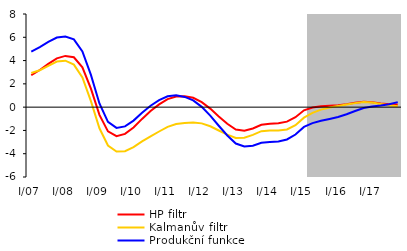
| Category | HP filtr | Kalmanův filtr | Produkční funkce |
|---|---|---|---|
| I/07 | 2.741 | 2.938 | 4.777 |
| II | 3.189 | 3.168 | 5.161 |
| III | 3.713 | 3.54 | 5.6 |
| IV | 4.189 | 3.913 | 5.974 |
| I/08 | 4.401 | 3.991 | 6.07 |
| II | 4.283 | 3.656 | 5.82 |
| III | 3.414 | 2.548 | 4.791 |
| IV | 1.584 | 0.521 | 2.77 |
| I/09 | -0.662 | -1.814 | 0.319 |
| II | -2.079 | -3.297 | -1.26 |
| III | -2.493 | -3.819 | -1.782 |
| IV | -2.295 | -3.787 | -1.652 |
| I/10 | -1.748 | -3.436 | -1.156 |
| II | -1.01 | -2.943 | -0.475 |
| III | -0.338 | -2.504 | 0.119 |
| IV | 0.239 | -2.092 | 0.598 |
| I/11 | 0.691 | -1.698 | 0.935 |
| II | 0.916 | -1.452 | 1.024 |
| III | 0.925 | -1.366 | 0.878 |
| IV | 0.801 | -1.313 | 0.581 |
| I/12 | 0.432 | -1.394 | 0.025 |
| II | -0.128 | -1.642 | -0.728 |
| III | -0.796 | -2.005 | -1.597 |
| IV | -1.429 | -2.362 | -2.434 |
| I/13 | -1.925 | -2.655 | -3.125 |
| II | -2.019 | -2.632 | -3.381 |
| III | -1.829 | -2.387 | -3.308 |
| IV | -1.51 | -2.062 | -3.058 |
| I/14 | -1.426 | -2.002 | -2.996 |
| II | -1.386 | -2.015 | -2.948 |
| III | -1.243 | -1.915 | -2.774 |
| IV | -0.868 | -1.555 | -2.352 |
| I/15 | -0.272 | -0.903 | -1.697 |
| II | -0.03 | -0.494 | -1.375 |
| III | 0.079 | -0.21 | -1.172 |
| IV | 0.128 | -0.026 | -1.014 |
| I/16 | 0.168 | 0.096 | -0.848 |
| II | 0.26 | 0.22 | -0.614 |
| III | 0.381 | 0.345 | -0.334 |
| IV | 0.47 | 0.435 | -0.073 |
| I/17 | 0.422 | 0.389 | 0.061 |
| II | 0.319 | 0.271 | 0.144 |
| III | 0.244 | 0.156 | 0.256 |
| IV | 0.234 | 0.07 | 0.432 |